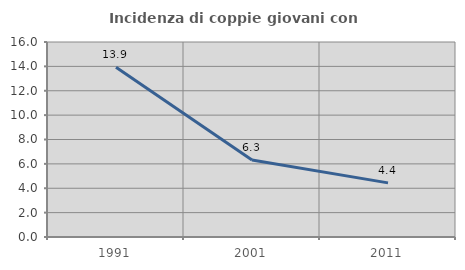
| Category | Incidenza di coppie giovani con figli |
|---|---|
| 1991.0 | 13.926 |
| 2001.0 | 6.326 |
| 2011.0 | 4.441 |